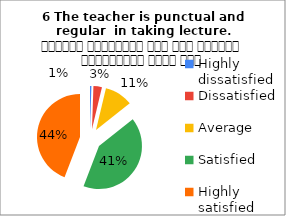
| Category | 6 The teacher is punctual and regular  in taking lecture. शिक्षक समयनिष्ठ हैं एवं नियमित व्याख्यान देते हैं |
|---|---|
| Highly dissatisfied | 1 |
| Dissatisfied | 6 |
| Average | 20 |
| Satisfied | 78 |
| Highly satisfied | 83 |